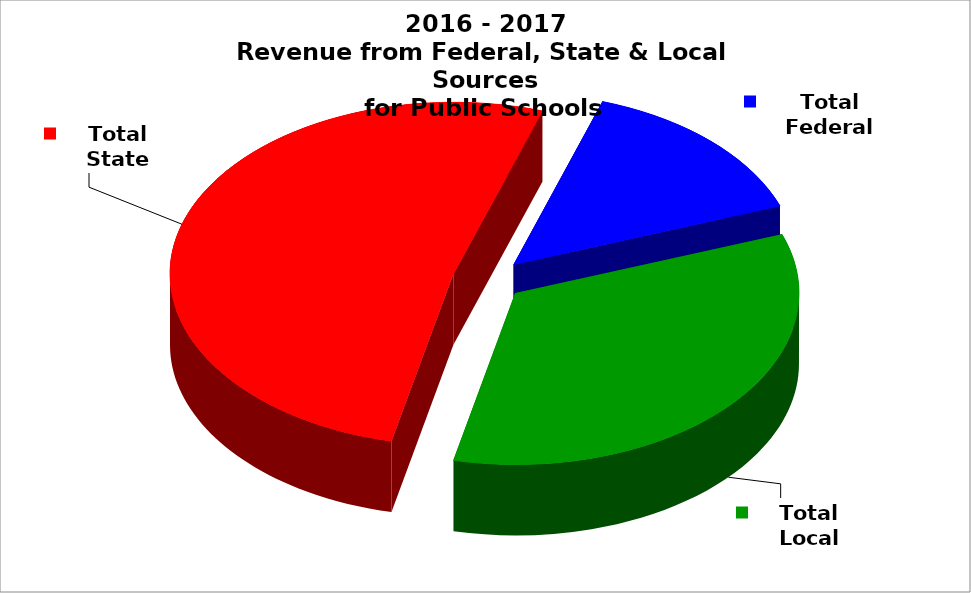
| Category | Series 0 |
|---|---|
| Total Local | 0.341 |
| Total State | 0.516 |
| Total Federal | 0.144 |